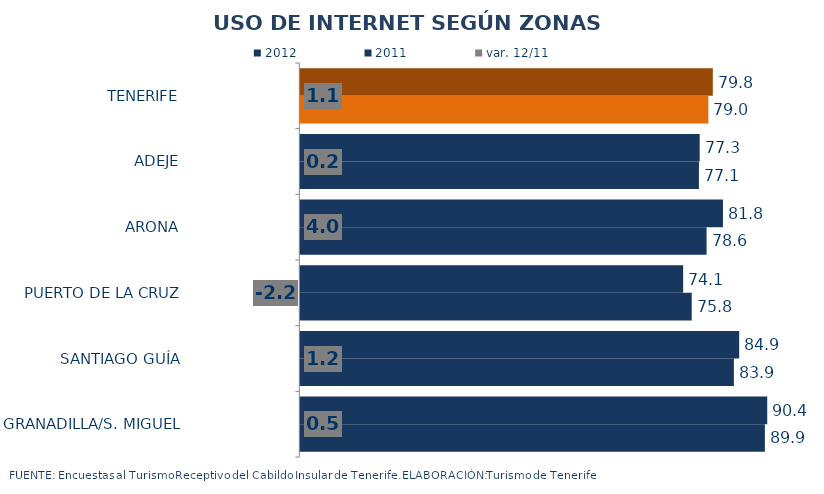
| Category | 2012 | 2011 |
|---|---|---|
| TENERIFE | 79.836 | 78.973 |
| ADEJE | 77.294 | 77.146 |
| ARONA | 81.799 | 78.625 |
| PUERTO DE LA CRUZ | 74.094 | 75.752 |
| SANTIAGO GUÍA | 84.944 | 83.911 |
| GRANADILLA/S. MIGUEL | 90.367 | 89.911 |